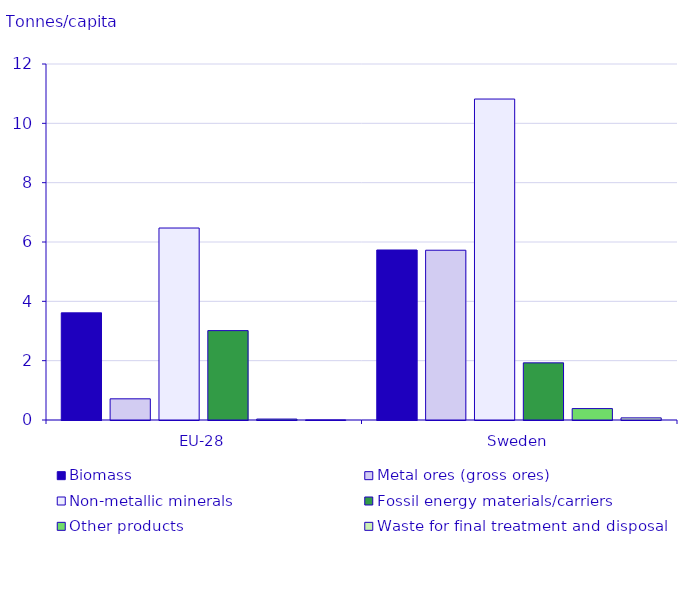
| Category | Biomass | Metal ores (gross ores) | Non-metallic minerals | Fossil energy materials/carriers | Other products | Waste for final treatment and disposal |
|---|---|---|---|---|---|---|
| EU-28 | 3.612 | 0.714 | 6.471 | 3.013 | 0.032 | 0.002 |
| Sweden | 5.731 | 5.723 | 10.819 | 1.926 | 0.385 | 0.072 |